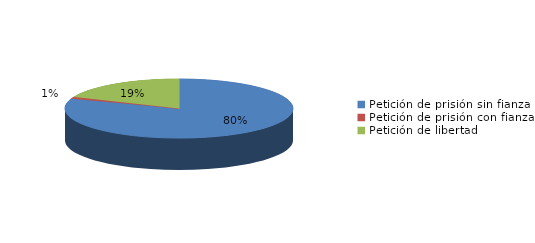
| Category | Series 0 |
|---|---|
| Petición de prisión sin fianza | 78 |
| Petición de prisión con fianza | 1 |
| Petición de libertad | 18 |